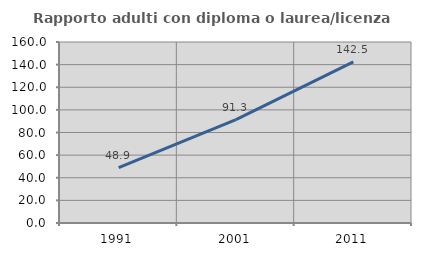
| Category | Rapporto adulti con diploma o laurea/licenza media  |
|---|---|
| 1991.0 | 48.889 |
| 2001.0 | 91.324 |
| 2011.0 | 142.505 |